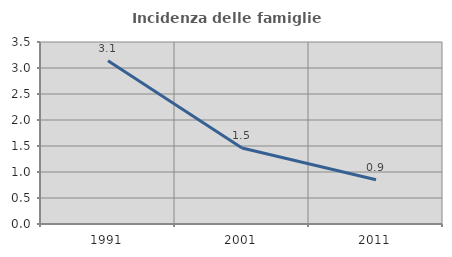
| Category | Incidenza delle famiglie numerose |
|---|---|
| 1991.0 | 3.142 |
| 2001.0 | 1.463 |
| 2011.0 | 0.85 |